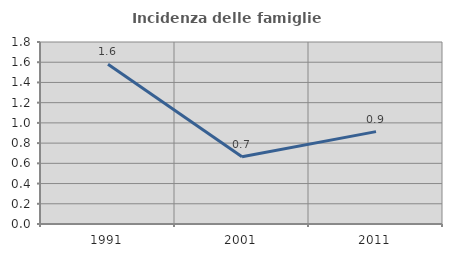
| Category | Incidenza delle famiglie numerose |
|---|---|
| 1991.0 | 1.581 |
| 2001.0 | 0.666 |
| 2011.0 | 0.913 |